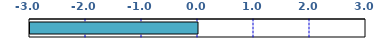
| Category | Series 0 |
|---|---|
| 0 | -5.328 |